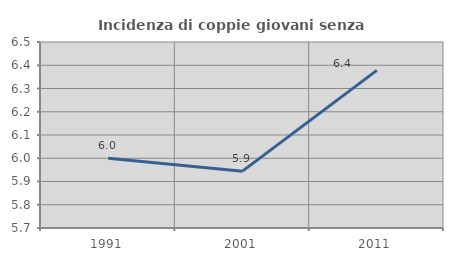
| Category | Incidenza di coppie giovani senza figli |
|---|---|
| 1991.0 | 6 |
| 2001.0 | 5.945 |
| 2011.0 | 6.378 |